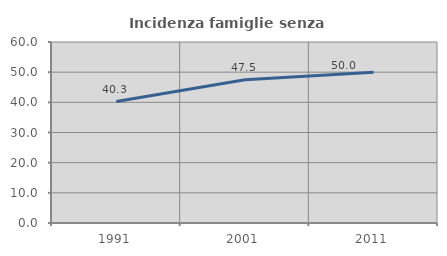
| Category | Incidenza famiglie senza nuclei |
|---|---|
| 1991.0 | 40.26 |
| 2001.0 | 47.471 |
| 2011.0 | 50 |